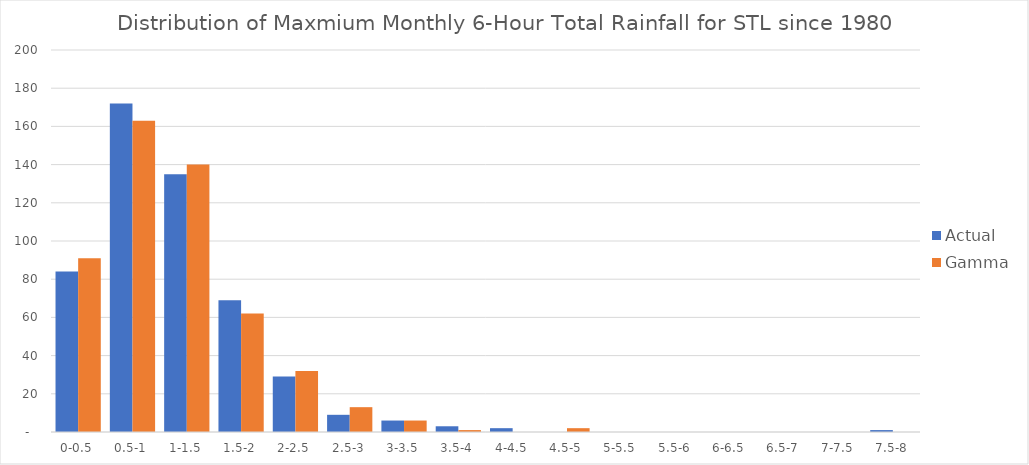
| Category | Actual | Gamma |
|---|---|---|
| 0-0.5 | 84 | 91 |
| 0.5-1 | 172 | 163 |
| 1-1.5 | 135 | 140 |
| 1.5-2 | 69 | 62 |
| 2-2.5 | 29 | 32 |
| 2.5-3 | 9 | 13 |
| 3-3.5 | 6 | 6 |
| 3.5-4 | 3 | 1 |
| 4-4.5 | 2 | 0 |
| 4.5-5 | 0 | 2 |
| 5-5.5 | 0 | 0 |
| 5.5-6 | 0 | 0 |
| 6-6.5 | 0 | 0 |
| 6.5-7 | 0 | 0 |
| 7-7.5 | 0 | 0 |
| 7.5-8 | 1 | 0 |